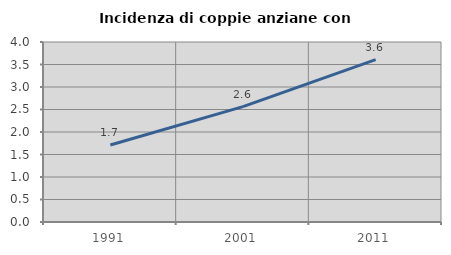
| Category | Incidenza di coppie anziane con figli |
|---|---|
| 1991.0 | 1.71 |
| 2001.0 | 2.565 |
| 2011.0 | 3.607 |